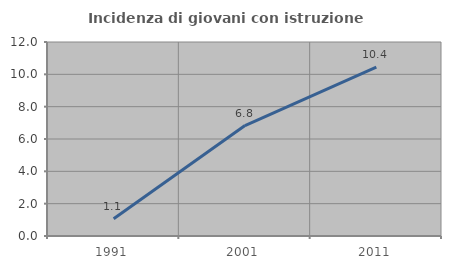
| Category | Incidenza di giovani con istruzione universitaria |
|---|---|
| 1991.0 | 1.064 |
| 2001.0 | 6.829 |
| 2011.0 | 10.44 |